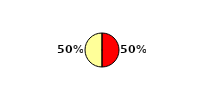
| Category | BAŞ. |
|---|---|
|  | 50 |
|  | 50 |